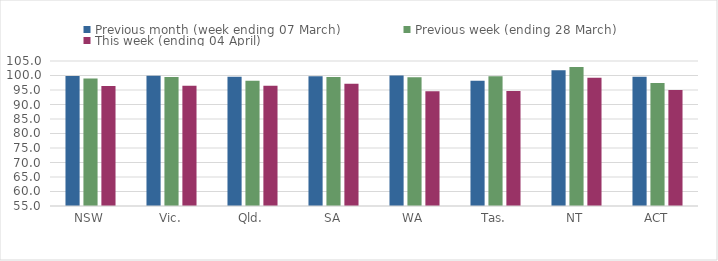
| Category | Previous month (week ending 07 March) | Previous week (ending 28 March) | This week (ending 04 April) |
|---|---|---|---|
| NSW | 99.798 | 98.932 | 96.406 |
| Vic. | 99.896 | 99.466 | 96.46 |
| Qld. | 99.535 | 98.158 | 96.505 |
| SA | 99.722 | 99.478 | 97.12 |
| WA | 99.996 | 99.409 | 94.578 |
| Tas. | 98.163 | 99.699 | 94.682 |
| NT | 101.835 | 102.965 | 99.2 |
| ACT | 99.582 | 97.377 | 95.021 |